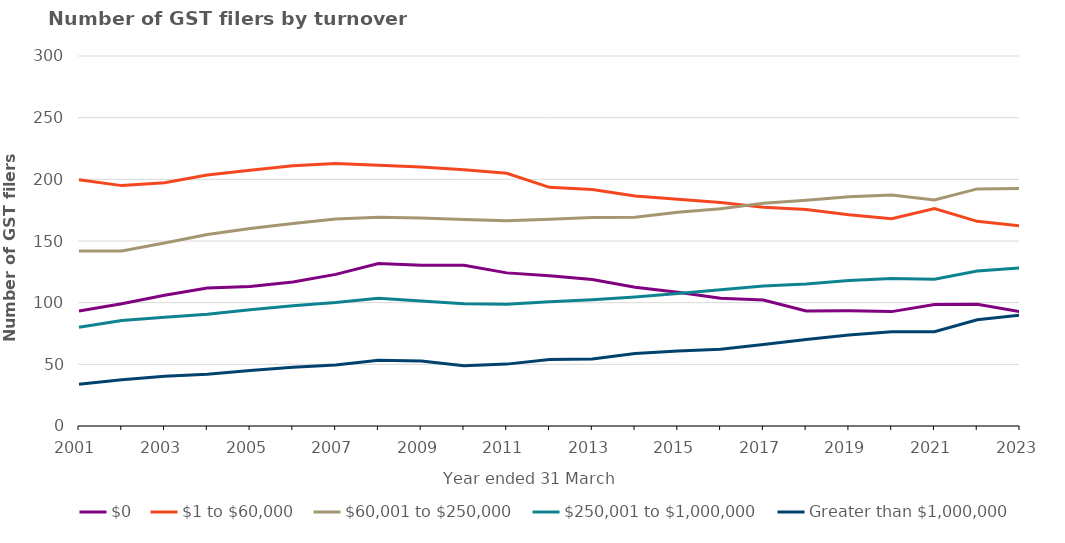
| Category | $0 | $1 to $60,000 | $60,001 to $250,000 | $250,001 to $1,000,000 | Greater than $1,000,000 |
|---|---|---|---|---|---|
| 2001-03-01 | 93313 | 199739 | 141840 | 80048 | 33937 |
| 2002-03-01 | 99154 | 194908 | 141931 | 85597 | 37492 |
| 2003-03-01 | 106089 | 197279 | 148309 | 88233 | 40245 |
| 2004-03-01 | 111913 | 203559 | 155296 | 90685 | 41915 |
| 2005-03-01 | 113103 | 207338 | 160061 | 94216 | 45046 |
| 2006-03-01 | 116750 | 211023 | 164106 | 97529 | 47679 |
| 2007-03-01 | 122958 | 212856 | 167874 | 100183 | 49488 |
| 2008-03-01 | 131759 | 211466 | 169177 | 103640 | 53226 |
| 2009-03-01 | 130422 | 210074 | 168744 | 101398 | 52623 |
| 2010-03-01 | 130254 | 207801 | 167452 | 99220 | 48906 |
| 2011-03-01 | 124149 | 204970 | 166371 | 98688 | 50171 |
| 2012-03-01 | 121915 | 193521 | 167722 | 100713 | 53851 |
| 2013-03-01 | 118700 | 191663 | 169004 | 102442 | 54310 |
| 2014-03-01 | 112479 | 186516 | 169166 | 104524 | 58702 |
| 2015-03-01 | 108516 | 183919 | 173359 | 107370 | 60831 |
| 2016-03-01 | 103613 | 181126 | 176226 | 110542 | 62320 |
| 2017-03-01 | 102098 | 177373 | 180622 | 113509 | 66089 |
| 2018-03-01 | 93326 | 175454 | 183085 | 115056 | 70160 |
| 2019-03-01 | 93407 | 171326 | 185807 | 117960 | 73728 |
| 2020-03-01 | 92741 | 168094 | 187252 | 119514 | 76486 |
| 2021-03-01 | 98493 | 176393 | 183336 | 119040 | 76461 |
| 2022-03-01 | 98686 | 165935 | 192263 | 125691 | 86176 |
| 2023-03-01 | 92709 | 162211 | 192675 | 128120 | 89873 |